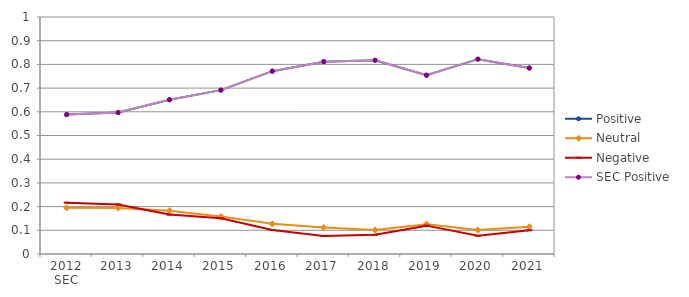
| Category | Positive | Neutral | Negative | SEC Positive |
|---|---|---|---|---|
| 0 | 0.588 | 0.195 | 0.216 | 0.588 |
| 1 | 0.597 | 0.194 | 0.209 | 0.597 |
| 2 | 0.651 | 0.183 | 0.166 | 0.651 |
| 3 | 0.691 | 0.158 | 0.151 | 0.691 |
| 4 | 0.771 | 0.127 | 0.101 | 0.771 |
| 5 | 0.812 | 0.112 | 0.076 | 0.812 |
| 6 | 0.817 | 0.101 | 0.081 | 0.817 |
| 7 | 0.754 | 0.126 | 0.12 | 0.754 |
| 8 | 0.822 | 0.101 | 0.077 | 0.822 |
| 9 | 0.785 | 0.115 | 0.1 | 0.785 |